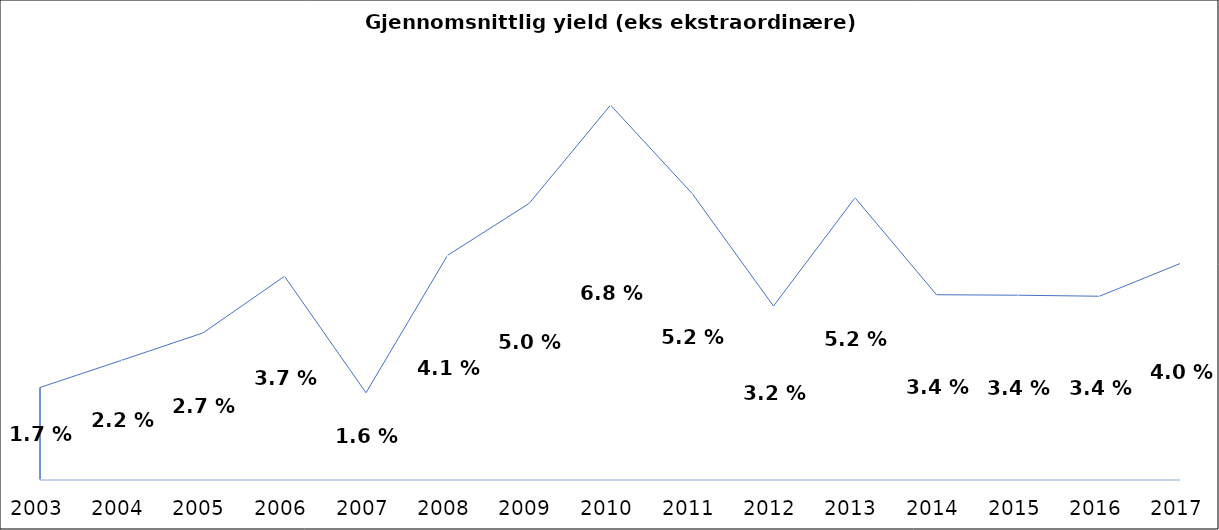
| Category | Gjennomsnitt |
|---|---|
| 2003.0 | 0.017 |
| 2004.0 | 0.022 |
| 2005.0 | 0.027 |
| 2006.0 | 0.037 |
| 2007.0 | 0.016 |
| 2008.0 | 0.041 |
| 2009.0 | 0.05 |
| 2010.0 | 0.068 |
| 2011.0 | 0.052 |
| 2012.0 | 0.032 |
| 2013.0 | 0.052 |
| 2014.0 | 0.034 |
| 2015.0 | 0.034 |
| 2016.0 | 0.034 |
| 2017.0 | 0.04 |